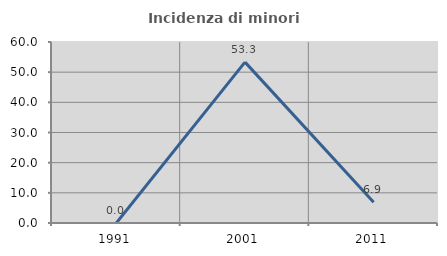
| Category | Incidenza di minori stranieri |
|---|---|
| 1991.0 | 0 |
| 2001.0 | 53.333 |
| 2011.0 | 6.897 |